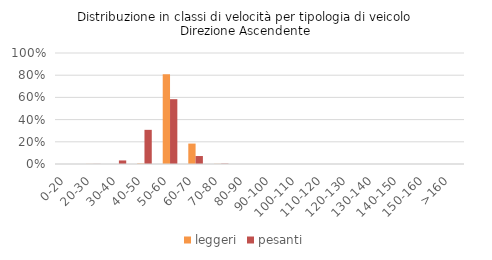
| Category | leggeri | pesanti |
|---|---|---|
| 0-20 | 0 | 0 |
| 20-30 | 0.001 | 0.001 |
| 30-40 | 0 | 0.032 |
| 40-50 | 0.004 | 0.308 |
| 50-60 | 0.809 | 0.584 |
| 60-70 | 0.184 | 0.072 |
| 70-80 | 0.002 | 0.003 |
| 80-90 | 0 | 0 |
| 90-100 | 0 | 0 |
| 100-110 | 0 | 0 |
| 110-120 | 0 | 0 |
| 120-130 | 0 | 0 |
| 130-140 | 0 | 0 |
| 140-150 | 0 | 0 |
| 150-160 | 0 | 0 |
| >160 | 0 | 0 |